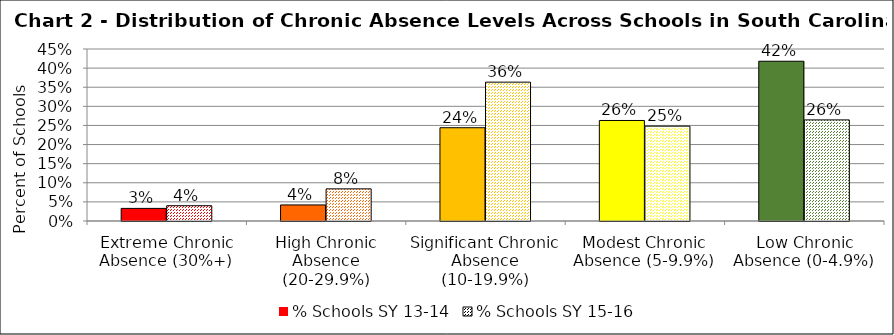
| Category | % Schools SY 13-14 | % Schools SY 15-16 |
|---|---|---|
| Extreme Chronic Absence (30%+) | 0.033 | 0.04 |
| High Chronic Absence (20-29.9%) | 0.042 | 0.084 |
| Significant Chronic Absence (10-19.9%) | 0.244 | 0.363 |
| Modest Chronic Absence (5-9.9%) | 0.263 | 0.248 |
| Low Chronic Absence (0-4.9%) | 0.418 | 0.264 |